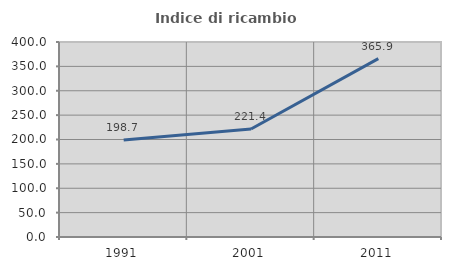
| Category | Indice di ricambio occupazionale  |
|---|---|
| 1991.0 | 198.734 |
| 2001.0 | 221.429 |
| 2011.0 | 365.909 |